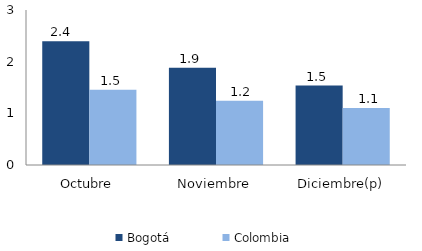
| Category | Bogotá | Colombia |
|---|---|---|
| Octubre | 2.396 | 1.454 |
| Noviembre | 1.882 | 1.241 |
| Diciembre(p) | 1.536 | 1.102 |